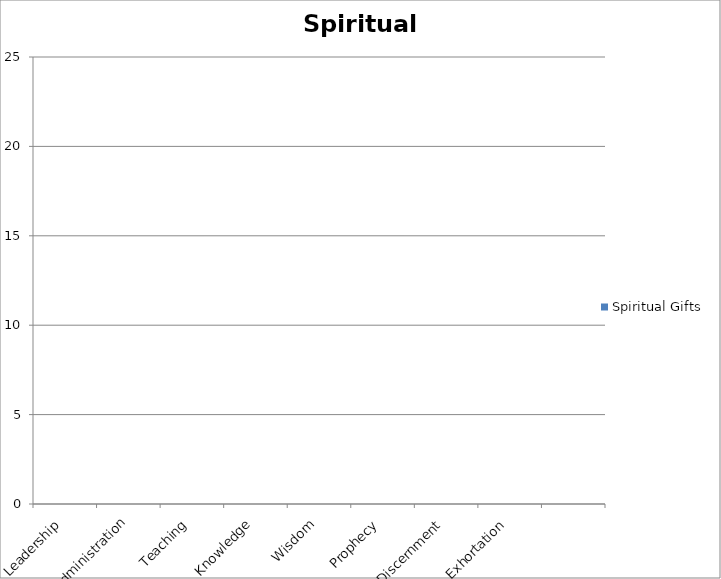
| Category | Spiritual Gifts |
|---|---|
| Leadership | 0 |
| Administration | 0 |
| Teaching | 0 |
| Knowledge | 0 |
| Wisdom | 0 |
| Prophecy | 0 |
| Discernment | 0 |
| Exhortation | 0 |